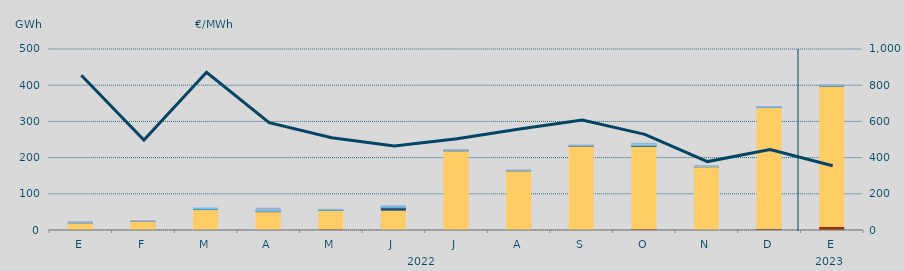
| Category | Carbón | Ciclo Combinado | Cogeneración | Consumo Bombeo | Enlace Península Baleares | Eólica | Hidráulica | Internacionales | Otras Renovables | Residuos no Renovables | Solar fotovoltaica | Solar térmica | Turbinación bombeo |
|---|---|---|---|---|---|---|---|---|---|---|---|---|---|
| E | 0 | 21421.9 | 0 | 131 | 0 | 0 | 11.7 | 0 | 0 | 0 | 0 | 0 | 3055.8 |
| F | 0 | 25414.5 | 0 | 90.9 | 0 | 0 | 0 | 0 | 0 | 0 | 0 | 0 | 102.5 |
| M | 0 | 58378.9 | 0 | 0 | 204 | 0 | 2030 | 0 | 0 | 0 | 0 | 0 | 1537.1 |
| A | 2650 | 49297.5 | 0 | 1035.9 | 250 | 0 | 506.1 | 0 | 0 | 0 | 0 | 0 | 8012.5 |
| M | 4151 | 51455.8 | 0 | 906.775 | 0 | 0 | 22.4 | 0 | 0 | 0 | 0 | 0 | 1817.044 |
| J | 865 | 55112.458 | 0 | 7229.298 | 0 | 0.5 | 1411.333 | 0 | 0 | 0 | 0 | 0 | 3733.801 |
| J | 60 | 220106.232 | 0 | 916.465 | 0 | 0 | 693.475 | 0 | 0 | 0 | 0 | 0 | 1555.3 |
| A | 115 | 164760.775 | 0 | 1020.576 | 102 | 0 | 100 | 0 | 0 | 0 | 0 | 0 | 81.25 |
| S | 555 | 232710.6 | 0 | 982.5 | 388.7 | 0 | 418.25 | 0 | 0 | 0 | 0 | 0 | 708.4 |
| O | 4836.8 | 227776.455 | 0 | 2792.6 | 0 | 0 | 208.75 | 3824.8 | 0 | 0 | 0 | 0 | 1365.5 |
| N | 2212.7 | 174006.854 | 0 | 126 | 0 | 0 | 449.2 | 613.333 | 0 | 0 | 0 | 0 | 1312.25 |
| D | 5478 | 334554.358 | 0 | 258.25 | 0 | 0 | 227.925 | 0 | 0 | 0 | 0 | 0 | 1594.663 |
| E | 11268 | 387716.675 | 0 | 572.573 | 681.8 | 0 | 835.85 | 0 | 0 | 0 | 0 | 0 | 77.5 |